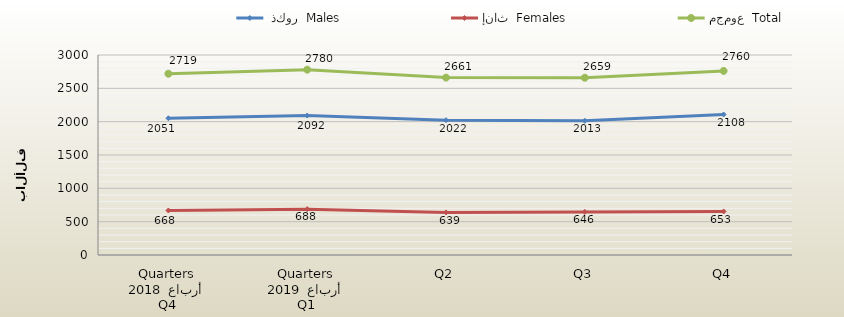
| Category |  ذكور  Males | إناث  Females | مجموع  Total |
|---|---|---|---|
| 0 | 2051 | 668 | 2719 |
| 1 | 2092 | 688 | 2780 |
| 2 | 2022 | 639 | 2661 |
| 3 | 2013 | 646 | 2659 |
| 4 | 2108 | 653 | 2761 |